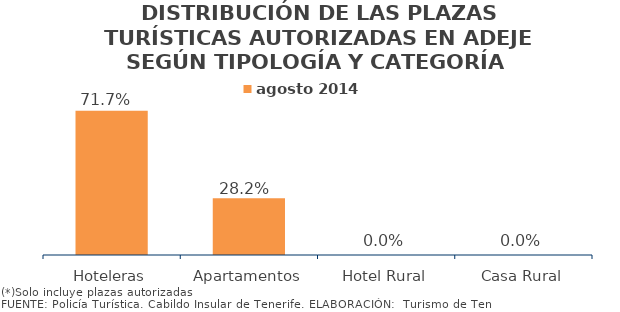
| Category | agosto 2014 |
|---|---|
| Hoteleras | 0.717 |
| Apartamentos | 0.282 |
| Hotel Rural | 0 |
| Casa Rural | 0 |